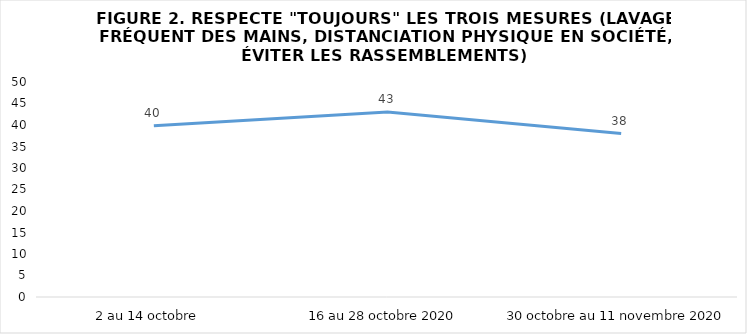
| Category | Series 0 |
|---|---|
| 2 au 14 octobre  | 39.85 |
| 16 au 28 octobre 2020 | 43 |
| 30 octobre au 11 novembre 2020 | 38 |